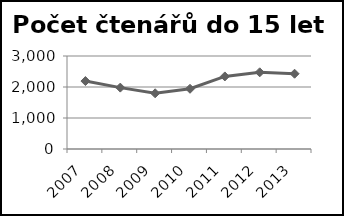
| Category | Počet čtenářů do 15 let |
|---|---|
| 2007.0 | 2192 |
| 2008.0 | 1980 |
| 2009.0 | 1797 |
| 2010.0 | 1943 |
| 2011.0 | 2341 |
| 2012.0 | 2474 |
| 2013.0 | 2428 |